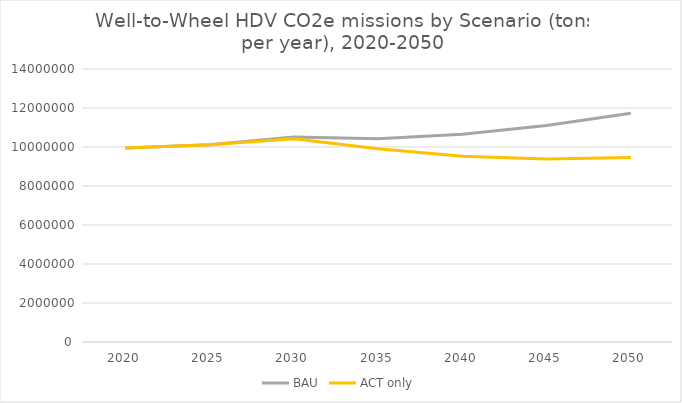
| Category | BAU | ACT only |
|---|---|---|
| 2020.0 | 9945933.103 | 9945933.103 |
| 2025.0 | 10109418.774 | 10109418.774 |
| 2030.0 | 10509589.209 | 10426876.526 |
| 2035.0 | 10420018.472 | 9906619.438 |
| 2040.0 | 10651415.469 | 9523113.189 |
| 2045.0 | 11100020.534 | 9382905.856 |
| 2050.0 | 11727966.06 | 9456794.079 |